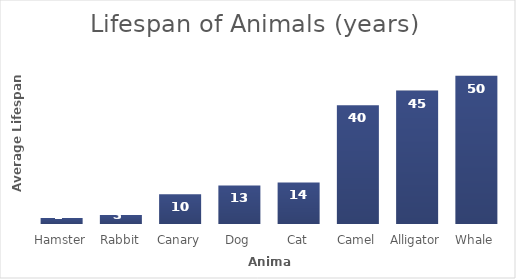
| Category | Lifespan |
|---|---|
| Hamster | 2 |
| Rabbit | 3 |
| Canary | 10 |
| Dog | 13 |
| Cat | 14 |
| Camel | 40 |
| Alligator | 45 |
| Whale | 50 |